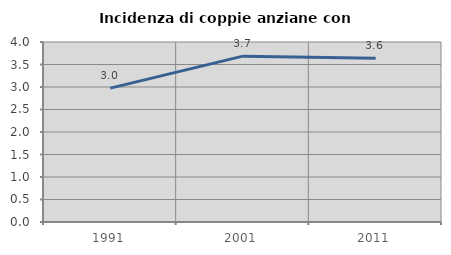
| Category | Incidenza di coppie anziane con figli |
|---|---|
| 1991.0 | 2.974 |
| 2001.0 | 3.685 |
| 2011.0 | 3.636 |